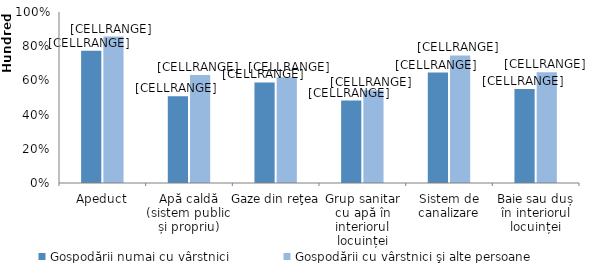
| Category | Gospodării numai cu vârstnici | Gospodării cu vârstnici şi alte persoane |
|---|---|---|
| Apeduct | 77.3 | 85.6 |
| Apă caldă (sistem public și propriu) | 50.7 | 63.1 |
| Gaze din reţea | 58.8 | 61.8 |
| Grup sanitar cu apă în interiorul locuinței | 48.2 | 54.3 |
| Sistem de canalizare | 64.6 | 74.6 |
| Baie sau duș în interiorul locuinței | 54.9 | 64.8 |